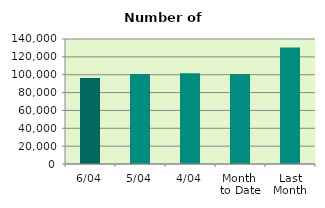
| Category | Series 0 |
|---|---|
| 6/04 | 96238 |
| 5/04 | 100940 |
| 4/04 | 101588 |
| Month 
to Date | 100848.5 |
| Last
Month | 130565.565 |